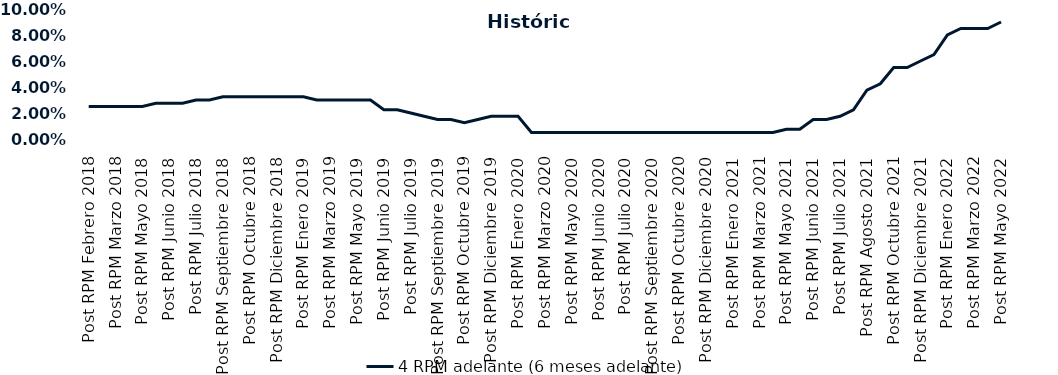
| Category | 4 RPM adelante (6 meses adelante) |
|---|---|
| Post RPM Febrero 2018 | 0.025 |
| Pre RPM Marzo 2018 | 0.025 |
| Post RPM Marzo 2018 | 0.025 |
| Pre RPM Mayo 2018 | 0.025 |
| Post RPM Mayo 2018 | 0.025 |
| Pre RPM Junio 2018 | 0.028 |
| Post RPM Junio 2018 | 0.028 |
| Pre RPM Julio 2018 | 0.028 |
| Post RPM Julio 2018 | 0.03 |
| Pre RPM Septiembre 2018 | 0.03 |
| Post RPM Septiembre 2018 | 0.032 |
| Pre RPM Octubre 2018 | 0.032 |
| Post RPM Octubre 2018 | 0.032 |
| Pre RPM Diciembre 2018 | 0.032 |
| Post RPM Diciembre 2018 | 0.032 |
| Pre RPM Enero 2019 | 0.032 |
| Post RPM Enero 2019 | 0.032 |
| Pre RPM Marzo 2019 | 0.03 |
| Post RPM Marzo 2019 | 0.03 |
| Pre RPM Mayo 2019 | 0.03 |
| Post RPM Mayo 2019 | 0.03 |
| Pre RPM Junio 2019 | 0.03 |
| Post RPM Junio 2019 | 0.022 |
| Pre RPM Julio 2019 | 0.022 |
| Post RPM Julio 2019 | 0.02 |
| Pre RPM Septiembre 2019 | 0.018 |
| Post RPM Septiembre 2019 | 0.015 |
| Pre RPM Octubre 2019 | 0.015 |
| Post RPM Octubre 2019 | 0.012 |
| Pre RPM Diciembre 2019 | 0.015 |
| Post RPM Diciembre 2019 | 0.018 |
| Pre RPM Enero 2020 | 0.018 |
| Post RPM Enero 2020 | 0.018 |
| Pre RPM Marzo 2020 | 0.005 |
| Post RPM Marzo 2020 | 0.005 |
| Pre RPM Mayo 2020 | 0.005 |
| Post RPM Mayo 2020 | 0.005 |
| Pre RPM Junio 2020 | 0.005 |
| Post RPM Junio 2020 | 0.005 |
| Pre RPM Julio 2020 | 0.005 |
| Post RPM Julio 2020 | 0.005 |
| Pre RPM Septiembre 2020 | 0.005 |
| Post RPM Septiembre 2020 | 0.005 |
| Pre RPM Octubre 2020 | 0.005 |
| Post RPM Octubre 2020 | 0.005 |
| Pre RPM Diciembre 2020 | 0.005 |
| Post RPM Diciembre 2020 | 0.005 |
| Pre RPM Enero 2021 | 0.005 |
| Post RPM Enero 2021 | 0.005 |
| Pre RPM Marzo 2021 | 0.005 |
| Post RPM Marzo 2021 | 0.005 |
| Pre RPM Mayo 2021 | 0.005 |
| Post RPM Mayo 2021 | 0.008 |
| Pre RPM Junio 2021 | 0.008 |
| Post RPM Junio 2021 | 0.015 |
| Pre RPM Julio 2021 | 0.015 |
| Post RPM Julio 2021 | 0.018 |
| Pre RPM Agosto 2021 | 0.022 |
| Post RPM Agosto 2021 | 0.038 |
| Pre RPM Octubre 2021 | 0.042 |
| Post RPM Octubre 2021 | 0.055 |
| Pre RPM Diciembre 2021 | 0.055 |
| Post RPM Diciembre 2021 | 0.06 |
| Pre RPM Enero 2022 | 0.065 |
| Post RPM Enero 2022 | 0.08 |
| Pre RPM Marzo 2022 | 0.085 |
| Post RPM Marzo 2022 | 0.085 |
| Pre RPM Mayo 2022 | 0.085 |
| Post RPM Mayo 2022 | 0.09 |